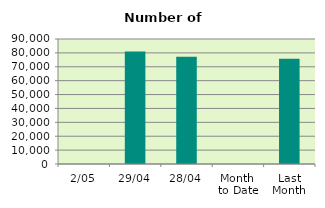
| Category | Series 0 |
|---|---|
| 2/05 | 0 |
| 29/04 | 81076 |
| 28/04 | 77282 |
| Month 
to Date | 0 |
| Last
Month | 75814.526 |